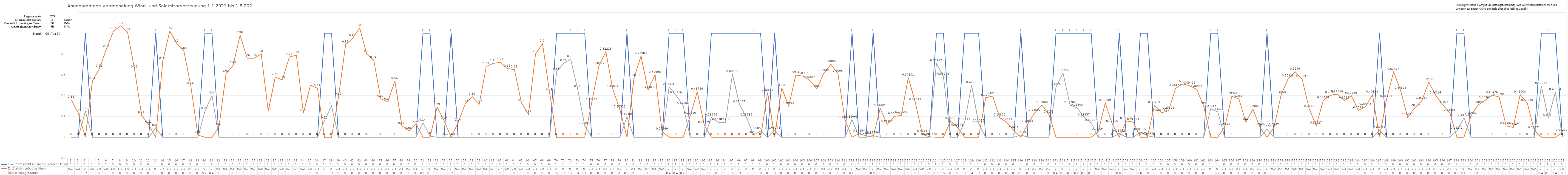
| Category | 1 = Strom reicht im Tagesdurchschnitt aus | Zusätzlich benötigter Strom | Überschüssiger Strom |
|---|---|---|---|
| 0 | 0 | 0.36 | 0 |
| 1 | 0 | 0.23 | 0 |
| 2 | 1 | 0 | 0.25 |
| 3 | 0 | 0.54 | 0 |
| 4 | 0 | 0.66 | 0 |
| 5 | 0 | 0.85 | 0 |
| 6 | 0 | 1.02 | 0 |
| 7 | 0 | 1.07 | 0 |
| 8 | 0 | 1.01 | 0 |
| 9 | 0 | 0.65 | 0 |
| 10 | 0 | 0.21 | 0 |
| 11 | 0 | 0.12 | 0 |
| 12 | 1 | 0 | 0.09 |
| 13 | 0 | 0.73 | 0 |
| 14 | 0 | 1.02 | 0 |
| 15 | 0 | 0.9 | 0 |
| 16 | 0 | 0.83 | 0 |
| 17 | 0 | 0.49 | 0 |
| 18 | 0 | 0.02 | 0 |
| 19 | 1 | 0 | 0.25 |
| 20 | 1 | 0 | 0.4 |
| 21 | 0 | 0.1 | 0 |
| 22 | 0 | 0.61 | 0 |
| 23 | 0 | 0.69 | 0 |
| 24 | 0 | 0.98 | 0 |
| 25 | 0 | 0.76 | 0 |
| 26 | 0 | 0.76 | 0 |
| 27 | 0 | 0.8 | 0 |
| 28 | 0 | 0.25 | 0 |
| 29 | 0 | 0.58 | 0 |
| 30 | 0 | 0.55 | 0 |
| 31 | 0 | 0.77 | 0 |
| 32 | 0 | 0.79 | 0 |
| 33 | 0 | 0.23 | 0 |
| 34 | 0 | 0.5 | 0 |
| 35 | 0 | 0.47 | 0 |
| 36 | 1 | 0 | 0.16 |
| 37 | 1 | 0 | 0.3 |
| 38 | 0 | 0.39 | 0 |
| 39 | 0 | 0.89 | 0 |
| 40 | 0 | 0.95 | 0 |
| 41 | 0 | 1.05 | 0 |
| 42 | 0 | 0.8 | 0 |
| 43 | 0 | 0.74 | 0 |
| 44 | 0 | 0.37 | 0 |
| 45 | 0 | 0.34 | 0 |
| 46 | 0 | 0.54 | 0 |
| 47 | 0 | 0.11 | 0 |
| 48 | 0 | 0.06 | 0 |
| 49 | 0 | 0.13 | 0 |
| 50 | 1 | 0 | 0.14 |
| 51 | 1 | 0 | 0.01 |
| 52 | 0 | 0.29 | 0 |
| 53 | 0 | 0.16 | 0 |
| 54 | 1 | 0 | 0 |
| 55 | 0 | 0.14 | 0 |
| 56 | 0 | 0.32 | 0 |
| 57 | 0 | 0.39 | 0 |
| 58 | 0 | 0.32 | 0 |
| 59 | 0 | 0.68 | 0 |
| 60 | 0 | 0.71 | 0 |
| 61 | 0 | 0.72 | 0 |
| 62 | 0 | 0.66 | 0 |
| 63 | 0 | 0.65 | 0 |
| 64 | 0 | 0.33 | 0 |
| 65 | 0 | 0.22 | 0 |
| 66 | 0 | 0.8 | 0 |
| 67 | 0 | 0.9 | 0 |
| 68 | 0 | 0.43 | 0 |
| 69 | 1 | 0 | 0.63 |
| 70 | 1 | 0 | 0.71 |
| 71 | 1 | 0 | 0.75 |
| 72 | 1 | 0 | 0.46 |
| 73 | 1 | 0 | 0.11 |
| 74 | 0 | 0.335 | 0 |
| 75 | 0 | 0.683 | 0 |
| 76 | 0 | 0.822 | 0 |
| 77 | 0 | 0.459 | 0 |
| 78 | 0 | 0.265 | 0 |
| 79 | 1 | 0 | 0.195 |
| 80 | 0 | 0.568 | 0 |
| 81 | 0 | 0.78 | 0 |
| 82 | 0 | 0.454 | 0 |
| 83 | 0 | 0.6 | 0 |
| 84 | 0 | 0.055 | 0 |
| 85 | 1 | 0 | 0.484 |
| 86 | 1 | 0 | 0.402 |
| 87 | 1 | 0 | 0.297 |
| 88 | 0 | 0.206 | 0 |
| 89 | 0 | 0.437 | 0 |
| 90 | 0 | 0.115 | 0 |
| 91 | 1 | 0 | 0.189 |
| 92 | 1 | 0 | 0.142 |
| 93 | 1 | 0 | 0.144 |
| 94 | 1 | 0 | 0.606 |
| 95 | 1 | 0 | 0.315 |
| 96 | 1 | 0 | 0.189 |
| 97 | 1 | 0 | 0.021 |
| 98 | 1 | 0 | 0.059 |
| 99 | 0 | 0.428 | 0 |
| 100 | 1 | 0 | 0.063 |
| 101 | 0 | 0.473 | 0 |
| 102 | 0 | 0.298 | 0 |
| 103 | 0 | 0.597 | 0 |
| 104 | 0 | 0.587 | 0 |
| 105 | 0 | 0.546 | 0 |
| 106 | 0 | 0.465 | 0 |
| 107 | 0 | 0.616 | 0 |
| 108 | 0 | 0.701 | 0 |
| 109 | 0 | 0.61 | 0 |
| 110 | 0 | 0.166 | 0 |
| 111 | 1 | 0 | 0.17 |
| 112 | 0 | 0.034 | 0 |
| 113 | 0 | 0.014 | 0 |
| 114 | 1 | 0 | 0.016 |
| 115 | 0 | 0.277 | 0 |
| 116 | 0 | 0.123 | 0 |
| 117 | 0 | 0.2 | 0 |
| 118 | 0 | 0.21 | 0 |
| 119 | 0 | 0.573 | 0 |
| 120 | 0 | 0.335 | 0 |
| 121 | 0 | 0.028 | 0 |
| 122 | 0 | 0.003 | 0 |
| 123 | 1 | 0 | 0.71 |
| 124 | 1 | 0 | 0.582 |
| 125 | 0 | 0.155 | 0 |
| 126 | 0 | 0.092 | 0 |
| 127 | 1 | 0 | 0.142 |
| 128 | 1 | 0 | 0.5 |
| 129 | 1 | 0 | 0.131 |
| 130 | 0 | 0.379 | 0 |
| 131 | 0 | 0.395 | 0 |
| 132 | 0 | 0.188 | 0 |
| 133 | 0 | 0.143 | 0 |
| 134 | 0 | 0.064 | 0 |
| 135 | 1 | 0 | 0.021 |
| 136 | 0 | 0.129 | 0 |
| 137 | 0 | 0.236 | 0 |
| 138 | 0 | 0.309 | 0 |
| 139 | 0 | 0.217 | 0 |
| 140 | 1 | 0 | 0.482 |
| 141 | 1 | 0 | 0.617 |
| 142 | 1 | 0 | 0.307 |
| 143 | 1 | 0 | 0.283 |
| 144 | 1 | 0 | 0.189 |
| 145 | 1 | 0 | 0.138 |
| 146 | 0 | 0.052 | 0 |
| 147 | 0 | 0.329 | 0 |
| 148 | 0 | 0.128 | 0 |
| 149 | 1 | 0 | 0.035 |
| 150 | 0 | 0.156 | 0 |
| 151 | 0 | 0.146 | 0 |
| 152 | 1 | 0 | 0.05 |
| 153 | 1 | 0 | 0.014 |
| 154 | 0 | 0.307 | 0 |
| 155 | 0 | 0.234 | 0 |
| 156 | 0 | 0.255 | 0 |
| 157 | 0 | 0.469 | 0 |
| 158 | 0 | 0.512 | 0 |
| 159 | 0 | 0.495 | 0 |
| 160 | 0 | 0.461 | 0 |
| 161 | 0 | 0.3 | 0 |
| 162 | 1 | 0 | 0.274 |
| 163 | 1 | 0 | 0.243 |
| 164 | 0 | 0.101 | 0 |
| 165 | 0 | 0.393 | 0 |
| 166 | 0 | 0.369 | 0 |
| 167 | 0 | 0.144 | 0 |
| 168 | 0 | 0.27 | 0 |
| 169 | 0 | 0.095 | 0 |
| 170 | 1 | 0 | 0.077 |
| 171 | 0 | 0.095 | 0 |
| 172 | 0 | 0.406 | 0 |
| 173 | 0 | 0.563 | 0 |
| 174 | 0 | 0.63 | 0 |
| 175 | 0 | 0.556 | 0 |
| 176 | 0 | 0.273 | 0 |
| 177 | 0 | 0.11 | 0 |
| 178 | 0 | 0.355 | 0 |
| 179 | 0 | 0.403 | 0 |
| 180 | 0 | 0.415 | 0 |
| 181 | 0 | 0.351 | 0 |
| 182 | 0 | 0.399 | 0 |
| 183 | 0 | 0.258 | 0 |
| 184 | 0 | 0.293 | 0 |
| 185 | 0 | 0.408 | 0 |
| 186 | 1 | 0 | 0.065 |
| 187 | 0 | 0.367 | 0 |
| 188 | 0 | 0.629 | 0 |
| 189 | 0 | 0.448 | 0 |
| 190 | 0 | 0.191 | 0 |
| 191 | 0 | 0.281 | 0 |
| 192 | 0 | 0.35 | 0 |
| 193 | 0 | 0.528 | 0 |
| 194 | 0 | 0.402 | 0 |
| 195 | 0 | 0.31 | 0 |
| 196 | 0 | 0.235 | 0 |
| 197 | 1 | 0 | 0.063 |
| 198 | 1 | 0 | 0.187 |
| 199 | 0 | 0.206 | 0 |
| 200 | 0 | 0.309 | 0 |
| 201 | 0 | 0.354 | 0 |
| 202 | 0 | 0.404 | 0 |
| 203 | 0 | 0.388 | 0 |
| 204 | 0 | 0.11 | 0 |
| 205 | 0 | 0.093 | 0 |
| 206 | 0 | 0.41 | 0 |
| 207 | 0 | 0.329 | 0 |
| 208 | 0 | 0.066 | 0 |
| 209 | 1 | 0 | 0.493 |
| 210 | 1 | 0 | 0.182 |
| 211 | 1 | 0 | 0.433 |
| 212 | 0 | 0.042 | 0 |